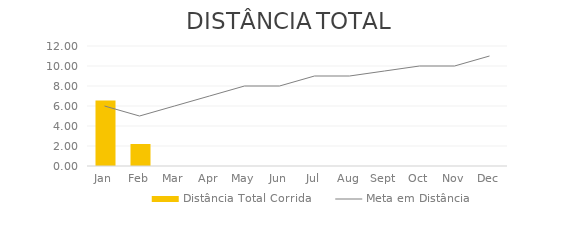
| Category | Distância Total Corrida |
|---|---|
| 2012-01-01 | 6.55 |
| 2012-02-01 | 2.2 |
| 2012-03-01 | 0 |
| 2012-04-01 | 0 |
| 2012-05-01 | 0 |
| 2012-06-01 | 0 |
| 2012-07-01 | 0 |
| 2012-08-01 | 0 |
| 2012-09-01 | 0 |
| 2012-10-01 | 0 |
| 2012-11-01 | 0 |
| 2012-12-01 | 0 |